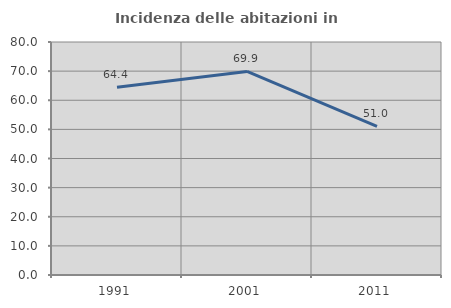
| Category | Incidenza delle abitazioni in proprietà  |
|---|---|
| 1991.0 | 64.427 |
| 2001.0 | 69.885 |
| 2011.0 | 51.007 |